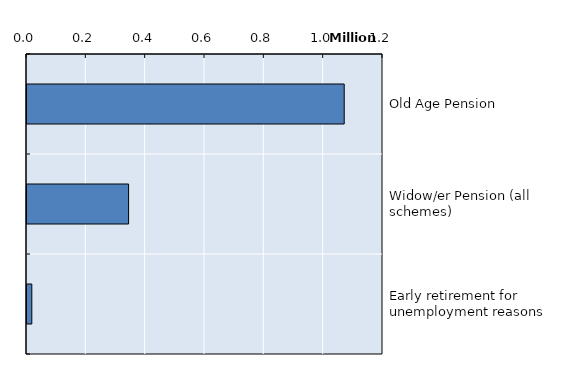
| Category | Series 0 |
|---|---|
| Old Age Pension | 1069255 |
| Widow/er Pension (all schemes) | 342401 |
| Early retirement for unemployment reasons | 16222 |